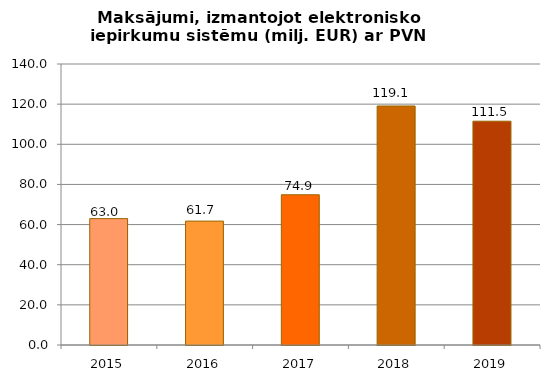
| Category | Maksājumi, izmantojot elektronisko iepirkumu sistēmu (milj. EUR) ar PVN |
|---|---|
| 2015.0 | 62.966 |
| 2016.0 | 61.731 |
| 2017.0 | 74.856 |
| 2018.0 | 119.077 |
| 2019.0 | 111.503 |